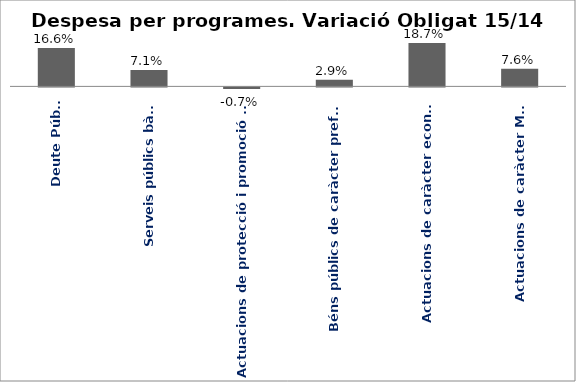
| Category | Series 0 |
|---|---|
| Deute Públic | 0.166 |
| Serveis públics bàsics | 0.071 |
| Actuacions de protecció i promoció social | -0.007 |
| Béns públics de caràcter preferent | 0.029 |
| Actuacions de caràcter econòmic | 0.187 |
| Actuacions de caràcter Marçal | 0.076 |